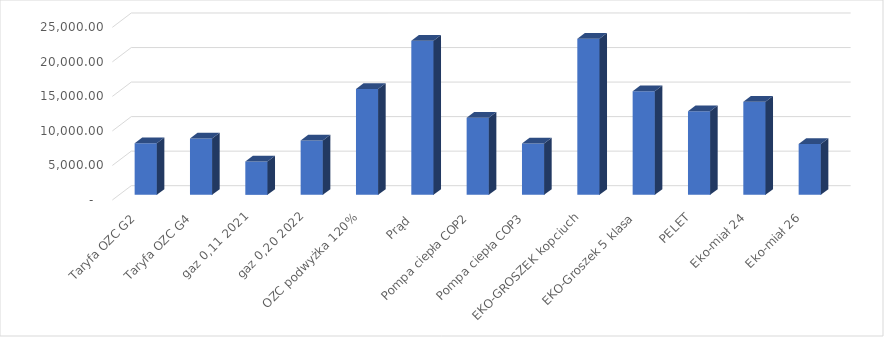
| Category | Series 0 |
|---|---|
| Taryfa OZC G2 | 7468.201 |
| Taryfa OZC G4 | 8165.166 |
| gaz 0,11 2021 | 4830.97 |
| gaz 0,20 2022 | 7878.404 |
| OZC podwyżka 120% | 15326.327 |
| Prąd  | 22313.74 |
| Pompa ciepła COP2 | 11156.87 |
| Pompa ciepła COP3 | 7437.913 |
| EKO-GROSZEK kopciuch | 22615.385 |
| EKO-Groszek 5 klasa | 15000 |
| PELET | 12098.765 |
| Eko-miał 24 | 13475 |
| Eko-miał 26 | 7350 |